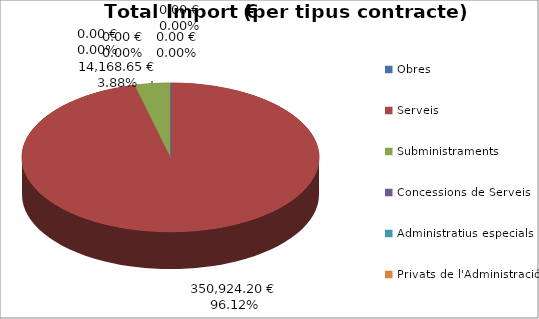
| Category | Total preu              (amb iva) |
|---|---|
| Obres | 0 |
| Serveis | 350924.2 |
| Subministraments | 14168.65 |
| Concessions de Serveis | 0 |
| Administratius especials | 0 |
| Privats de l'Administració | 0 |